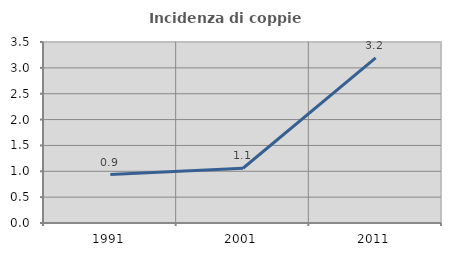
| Category | Incidenza di coppie miste |
|---|---|
| 1991.0 | 0.937 |
| 2001.0 | 1.059 |
| 2011.0 | 3.191 |